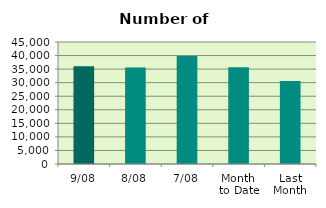
| Category | Series 0 |
|---|---|
| 9/08 | 36032 |
| 8/08 | 35556 |
| 7/08 | 39796 |
| Month 
to Date | 35669.429 |
| Last
Month | 30613.13 |